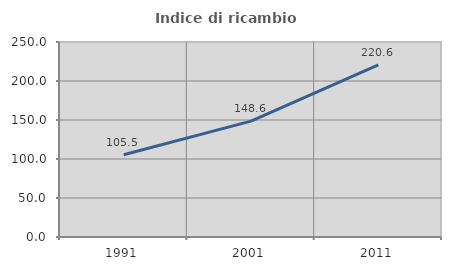
| Category | Indice di ricambio occupazionale  |
|---|---|
| 1991.0 | 105.52 |
| 2001.0 | 148.588 |
| 2011.0 | 220.612 |